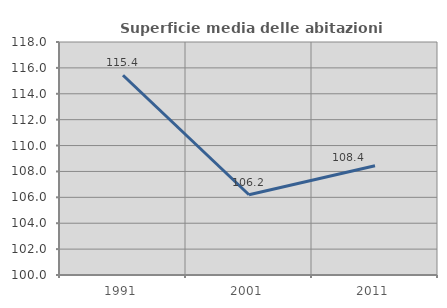
| Category | Superficie media delle abitazioni occupate |
|---|---|
| 1991.0 | 115.433 |
| 2001.0 | 106.197 |
| 2011.0 | 108.435 |